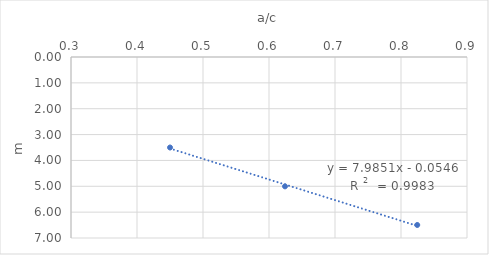
| Category | Series 0 |
|---|---|
| 0.45004500450045004 | 3.5 |
| 0.624249699879952 | 5.002 |
| 0.8245877061469266 | 6.496 |